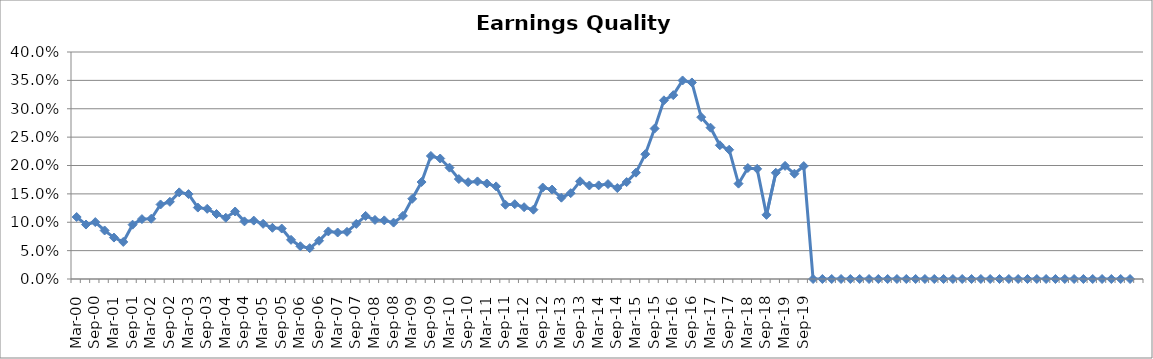
| Category | Rptd. Earnings Quality Indicator |
|---|---|
| Mar-00 | 0.109 |
| Jun-00 | 0.096 |
| Sep-00 | 0.1 |
| Dec-00 | 0.086 |
| Mar-01 | 0.073 |
| Jun-01 | 0.065 |
| Sep-01 | 0.096 |
| Dec-01 | 0.106 |
| Mar-02 | 0.106 |
| Jun-02 | 0.131 |
| Sep-02 | 0.136 |
| Dec-02 | 0.153 |
| Mar-03 | 0.15 |
| Jun-03 | 0.126 |
| Sep-03 | 0.124 |
| Dec-03 | 0.115 |
| Mar-04 | 0.108 |
| Jun-04 | 0.119 |
| Sep-04 | 0.102 |
| Dec-04 | 0.103 |
| Mar-05 | 0.097 |
| Jun-05 | 0.09 |
| Sep-05 | 0.089 |
| Dec-05 | 0.069 |
| Mar-06 | 0.058 |
| Jun-06 | 0.054 |
| Sep-06 | 0.067 |
| Dec-06 | 0.084 |
| Mar-07 | 0.082 |
| Jun-07 | 0.083 |
| Sep-07 | 0.097 |
| Dec-07 | 0.111 |
| Mar-08 | 0.104 |
| Jun-08 | 0.103 |
| Sep-08 | 0.099 |
| Dec-08 | 0.111 |
| Mar-09 | 0.141 |
| Jun-09 | 0.171 |
| Sep-09 | 0.217 |
| Dec-09 | 0.212 |
| Mar-10 | 0.196 |
| Jun-10 | 0.176 |
| Sep-10 | 0.171 |
| Dec-10 | 0.172 |
| Mar-11 | 0.168 |
| Jun-11 | 0.163 |
| Sep-11 | 0.131 |
| Dec-11 | 0.132 |
| Mar-12 | 0.127 |
| Jun-12 | 0.122 |
| Sep-12 | 0.161 |
| Dec-12 | 0.158 |
| Mar-13 | 0.143 |
| Jun-13 | 0.151 |
| Sep-13 | 0.172 |
| Dec-13 | 0.165 |
| Mar-14 | 0.165 |
| Jun-14 | 0.167 |
| Sep-14 | 0.16 |
| Dec-14 | 0.171 |
| Mar-15 | 0.187 |
| Jun-15 | 0.22 |
| Sep-15 | 0.265 |
| Dec-15 | 0.315 |
| Mar-16 | 0.324 |
| Jun-16 | 0.35 |
| Sep-16 | 0.346 |
| Dec-16 | 0.285 |
| Mar-17 | 0.267 |
| Jun-17 | 0.236 |
| Sep-17 | 0.228 |
| Dec-17 | 0.168 |
| Mar-18 | 0.196 |
| Jun-18 | 0.194 |
| Sep-18 | 0.113 |
| Dec-18 | 0.187 |
| Mar-19 | 0.199 |
| Jun-19 | 0.186 |
| Sep-19 | 0.199 |